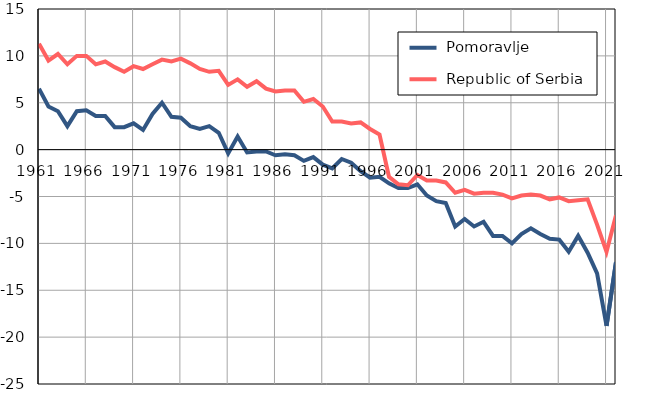
| Category |  Pomoravlje |  Republic of Serbia |
|---|---|---|
| 1961.0 | 6.5 | 11.3 |
| 1962.0 | 4.6 | 9.5 |
| 1963.0 | 4.1 | 10.2 |
| 1964.0 | 2.5 | 9.1 |
| 1965.0 | 4.1 | 10 |
| 1966.0 | 4.2 | 10 |
| 1967.0 | 3.6 | 9.1 |
| 1968.0 | 3.6 | 9.4 |
| 1969.0 | 2.4 | 8.8 |
| 1970.0 | 2.4 | 8.3 |
| 1971.0 | 2.8 | 8.9 |
| 1972.0 | 2.1 | 8.6 |
| 1973.0 | 3.8 | 9.1 |
| 1974.0 | 5 | 9.6 |
| 1975.0 | 3.5 | 9.4 |
| 1976.0 | 3.4 | 9.7 |
| 1977.0 | 2.5 | 9.2 |
| 1978.0 | 2.2 | 8.6 |
| 1979.0 | 2.5 | 8.3 |
| 1980.0 | 1.8 | 8.4 |
| 1981.0 | -0.4 | 6.9 |
| 1982.0 | 1.4 | 7.5 |
| 1983.0 | -0.3 | 6.7 |
| 1984.0 | -0.2 | 7.3 |
| 1985.0 | -0.2 | 6.5 |
| 1986.0 | -0.6 | 6.2 |
| 1987.0 | -0.5 | 6.3 |
| 1988.0 | -0.6 | 6.3 |
| 1989.0 | -1.2 | 5.1 |
| 1990.0 | -0.8 | 5.4 |
| 1991.0 | -1.6 | 4.6 |
| 1992.0 | -2 | 3 |
| 1993.0 | -1 | 3 |
| 1994.0 | -1.4 | 2.8 |
| 1995.0 | -2.3 | 2.9 |
| 1996.0 | -3 | 2.2 |
| 1997.0 | -2.9 | 1.6 |
| 1998.0 | -3.6 | -2.9 |
| 1999.0 | -4.1 | -3.7 |
| 2000.0 | -4.1 | -3.8 |
| 2001.0 | -3.7 | -2.7 |
| 2002.0 | -4.9 | -3.3 |
| 2003.0 | -5.5 | -3.3 |
| 2004.0 | -5.7 | -3.5 |
| 2005.0 | -8.2 | -4.6 |
| 2006.0 | -7.4 | -4.3 |
| 2007.0 | -8.2 | -4.7 |
| 2008.0 | -7.7 | -4.6 |
| 2009.0 | -9.2 | -4.6 |
| 2010.0 | -9.2 | -4.8 |
| 2011.0 | -10 | -5.2 |
| 2012.0 | -9 | -4.9 |
| 2013.0 | -8.4 | -4.8 |
| 2014.0 | -9 | -4.9 |
| 2015.0 | -9.5 | -5.3 |
| 2016.0 | -9.6 | -5.1 |
| 2017.0 | -10.9 | -5.5 |
| 2018.0 | -9.2 | -5.4 |
| 2019.0 | -11 | -5.3 |
| 2020.0 | -13.2 | -8 |
| 2021.0 | -18.8 | -10.9 |
| 2022.0 | -12 | -7 |